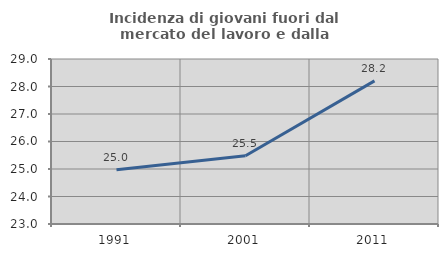
| Category | Incidenza di giovani fuori dal mercato del lavoro e dalla formazione  |
|---|---|
| 1991.0 | 24.974 |
| 2001.0 | 25.479 |
| 2011.0 | 28.203 |